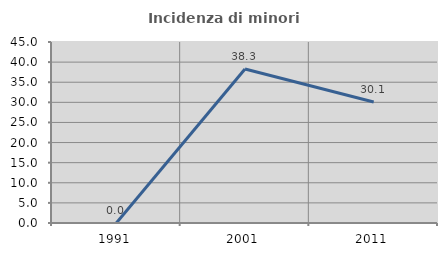
| Category | Incidenza di minori stranieri |
|---|---|
| 1991.0 | 0 |
| 2001.0 | 38.272 |
| 2011.0 | 30.093 |